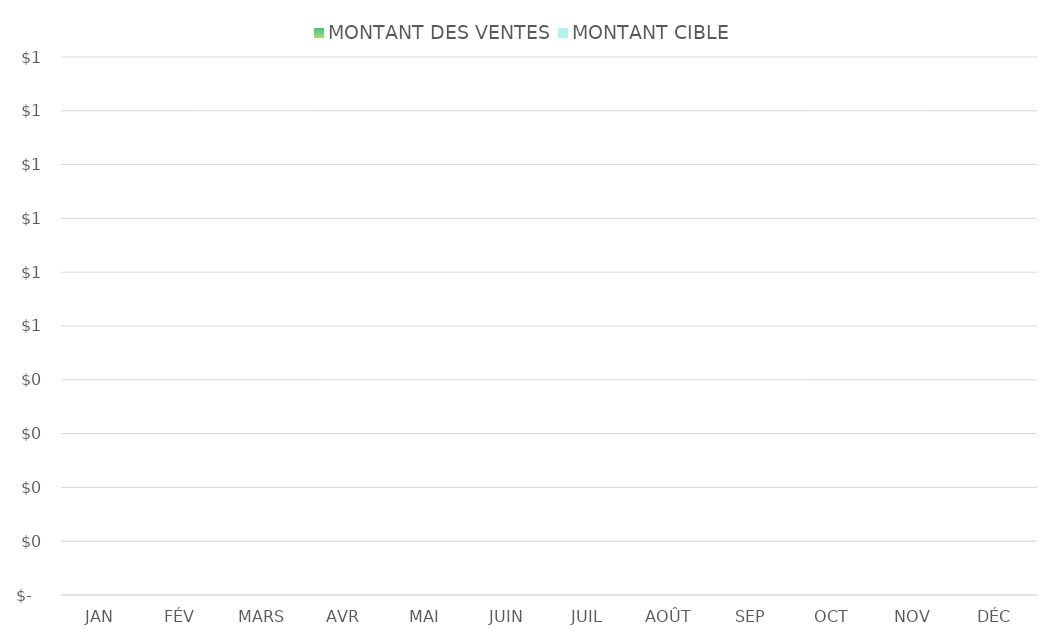
| Category | MONTANT DES VENTES | MONTANT CIBLE |
|---|---|---|
| JAN | 0 | 0 |
| FÉV | 0 | 0 |
| MARS | 0 | 0 |
| AVR | 0 | 0 |
| MAI | 0 | 0 |
| JUIN | 0 | 0 |
| JUIL | 0 | 0 |
| AOÛT | 0 | 0 |
| SEP | 0 | 0 |
| OCT | 0 | 0 |
| NOV | 0 | 0 |
| DÉC | 0 | 0 |